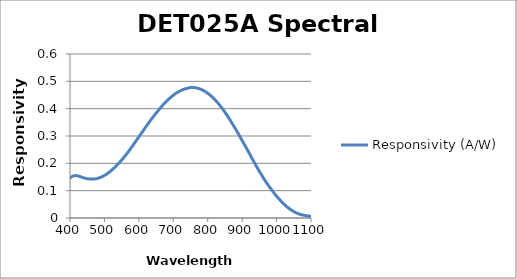
| Category | Responsivity (A/W) |
|---|---|
| 350.0 | 0.074 |
| 360.0 | 0.082 |
| 370.0 | 0.092 |
| 380.0 | 0.109 |
| 390.0 | 0.13 |
| 400.0 | 0.146 |
| 410.0 | 0.154 |
| 420.0 | 0.155 |
| 430.0 | 0.151 |
| 440.0 | 0.147 |
| 450.0 | 0.144 |
| 460.0 | 0.142 |
| 470.0 | 0.143 |
| 480.0 | 0.145 |
| 490.0 | 0.149 |
| 500.0 | 0.156 |
| 510.0 | 0.164 |
| 520.0 | 0.174 |
| 530.0 | 0.185 |
| 540.0 | 0.198 |
| 550.0 | 0.212 |
| 560.0 | 0.227 |
| 570.0 | 0.244 |
| 580.0 | 0.261 |
| 590.0 | 0.279 |
| 600.0 | 0.297 |
| 610.0 | 0.315 |
| 620.0 | 0.333 |
| 630.0 | 0.351 |
| 640.0 | 0.367 |
| 650.0 | 0.384 |
| 660.0 | 0.399 |
| 670.0 | 0.414 |
| 680.0 | 0.427 |
| 690.0 | 0.438 |
| 700.0 | 0.449 |
| 710.0 | 0.458 |
| 720.0 | 0.465 |
| 730.0 | 0.47 |
| 740.0 | 0.474 |
| 750.0 | 0.478 |
| 760.0 | 0.477 |
| 770.0 | 0.475 |
| 780.0 | 0.471 |
| 790.0 | 0.465 |
| 800.0 | 0.456 |
| 810.0 | 0.446 |
| 820.0 | 0.434 |
| 830.0 | 0.42 |
| 840.0 | 0.405 |
| 850.0 | 0.387 |
| 860.0 | 0.368 |
| 870.0 | 0.348 |
| 880.0 | 0.327 |
| 890.0 | 0.306 |
| 900.0 | 0.283 |
| 910.0 | 0.261 |
| 920.0 | 0.238 |
| 930.0 | 0.215 |
| 940.0 | 0.193 |
| 950.0 | 0.171 |
| 960.0 | 0.15 |
| 970.0 | 0.13 |
| 980.0 | 0.113 |
| 990.0 | 0.096 |
| 1000.0 | 0.08 |
| 1010.0 | 0.066 |
| 1020.0 | 0.053 |
| 1030.0 | 0.041 |
| 1040.0 | 0.031 |
| 1050.0 | 0.023 |
| 1060.0 | 0.017 |
| 1070.0 | 0.013 |
| 1080.0 | 0.01 |
| 1090.0 | 0.008 |
| 1100.0 | 0.006 |